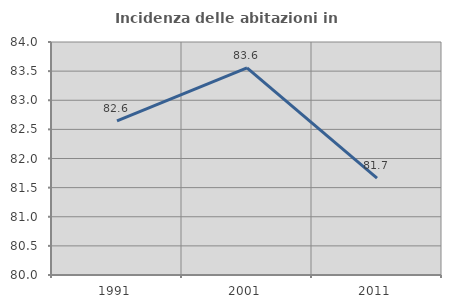
| Category | Incidenza delle abitazioni in proprietà  |
|---|---|
| 1991.0 | 82.647 |
| 2001.0 | 83.554 |
| 2011.0 | 81.663 |